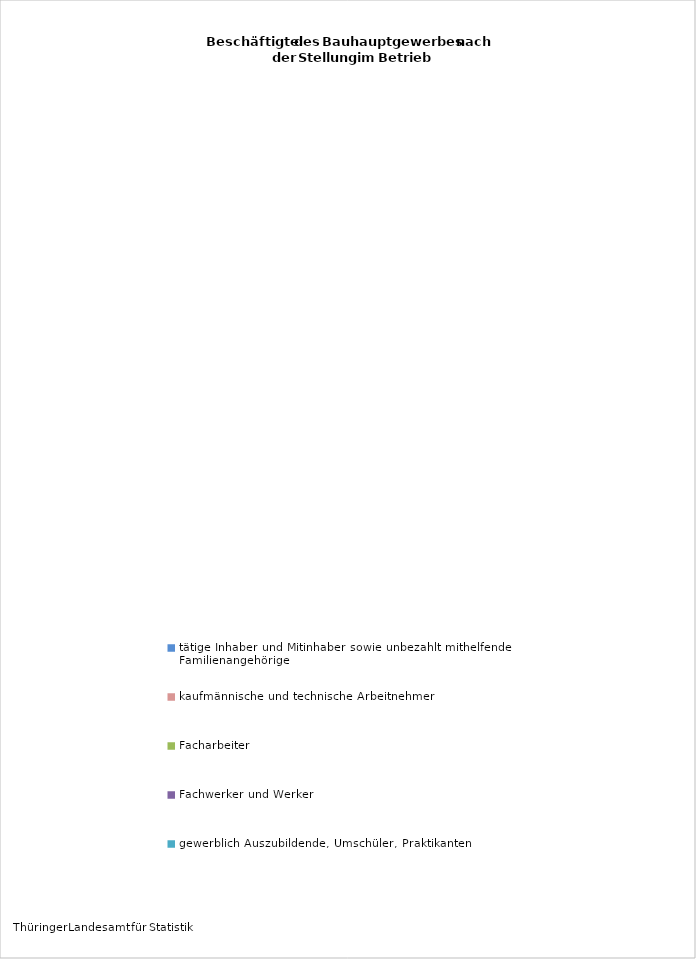
| Category | Beschäftigte |
|---|---|
| tätige Inhaber und Mitinhaber sowie unbezahlt mithelfende Familienangehörige | 2131 |
| kaufmännische und technische Arbeitnehmer | 5256 |
| Facharbeiter | 14144 |
| Fachwerker und Werker | 3567 |
| gewerblich Auszubildende, Umschüler, Praktikanten | 1053 |